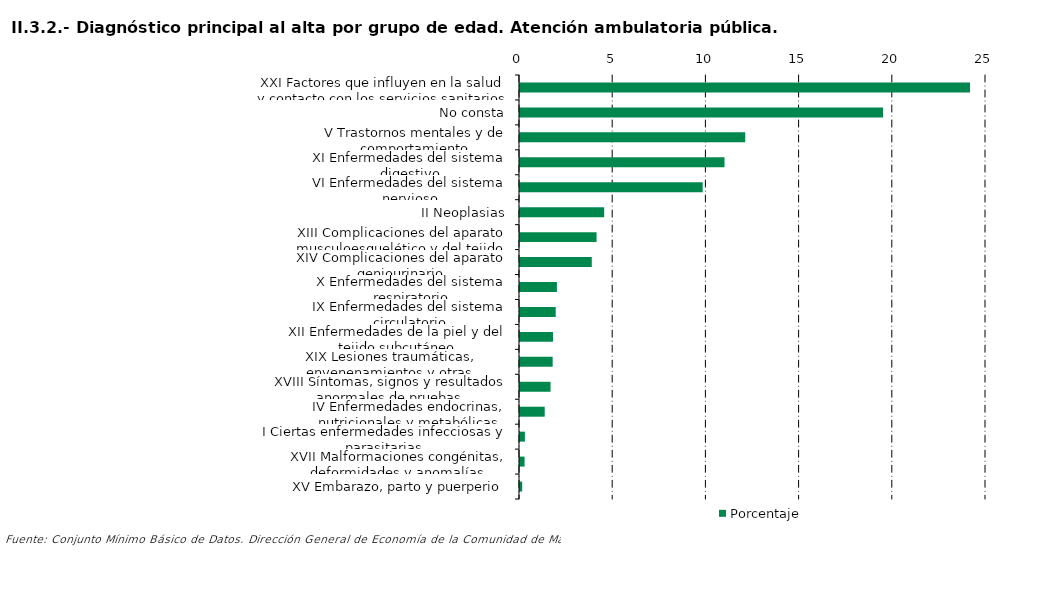
| Category | Porcentaje |
|---|---|
| XXI Factores que influyen en la salud y contacto con los servicios sanitarios | 24.144 |
| No consta | 19.474 |
| V Trastornos mentales y de comportamiento | 12.084 |
| XI Enfermedades del sistema digestivo | 10.971 |
| VI Enfermedades del sistema nervioso | 9.8 |
| II Neoplasias | 4.516 |
| XIII Complicaciones del aparato musculoesquelético y del tejido conectivo | 4.107 |
| XIV Complicaciones del aparato geniourinario | 3.85 |
| X Enfermedades del sistema respiratorio | 1.98 |
| IX Enfermedades del sistema circulatorio | 1.916 |
| XII Enfermedades de la piel y del tejido subcutáneo | 1.769 |
| XIX Lesiones traumáticas, envenenamientos y otras consecuencias de causas externas | 1.752 |
| XVIII Síntomas, signos y resultados anormales de pruebas complementarias, no clasificados bajo otro concepto | 1.639 |
| IV Enfermedades endocrinas, nutricionales y metabólicas | 1.326 |
| I Ciertas enfermedades infecciosas y parasitarias | 0.263 |
| XVII Malformaciones congénitas, deformidades y anomalías cromosómicas | 0.245 |
| XV Embarazo, parto y puerperio | 0.118 |